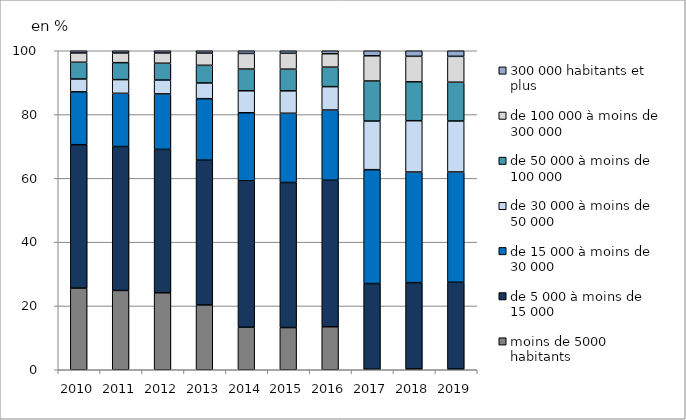
| Category | moins de 5000 habitants | de 5 000 à moins de 15 000 | de 15 000 à moins de 30 000 | de 30 000 à moins de 50 000 | de 50 000 à moins de 100 000 | de 100 000 à moins de 300 000 | 300 000 habitants et plus |
|---|---|---|---|---|---|---|---|
| 2010.0 | 25.584 | 44.964 | 16.584 | 4.021 | 5.247 | 2.911 | 0.689 |
| 2011.0 | 24.856 | 45.133 | 16.66 | 4.309 | 5.31 | 3.04 | 0.693 |
| 2012.0 | 24.138 | 44.944 | 17.396 | 4.339 | 5.269 | 3.216 | 0.697 |
| 2013.0 | 20.318 | 45.399 | 19.259 | 4.927 | 5.537 | 3.827 | 0.733 |
| 2014.0 | 13.333 | 45.874 | 21.352 | 6.9 | 6.807 | 4.895 | 0.839 |
| 2015.0 | 13.221 | 45.476 | 21.707 | 7.032 | 6.798 | 4.97 | 0.797 |
| 2016.0 | 13.482 | 45.926 | 22.017 | 7.323 | 6.111 | 4.219 | 0.921 |
| 2017.0 | 0.158 | 26.856 | 35.703 | 15.245 | 12.559 | 7.899 | 1.58 |
| 2018.0 | 0.238 | 27.078 | 34.679 | 16.073 | 12.193 | 7.997 | 1.742 |
| 2019.0 | 0.238 | 27.186 | 34.579 | 15.978 | 12.162 | 8.108 | 1.749 |